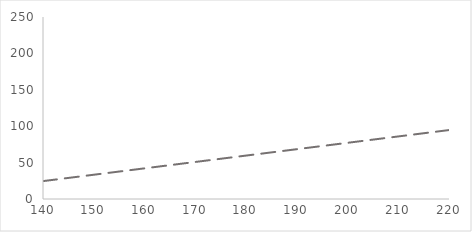
| Category | Series 0 |
|---|---|
| 140.0 | 24.569 |
| 150.0 | 33.335 |
| 160.0 | 42.102 |
| 170.0 | 50.868 |
| 180.0 | 59.635 |
| 190.0 | 68.401 |
| 200.0 | 77.168 |
| 210.0 | 85.934 |
| 220.0 | 94.701 |